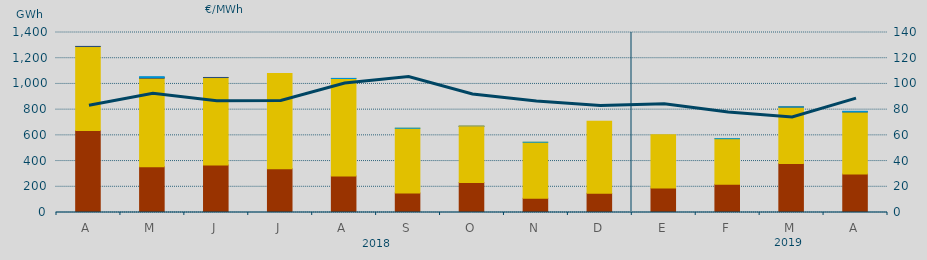
| Category | Carbón | Ciclo Combinado | Consumo Bombeo | Hidráulica | Otras Renovables |
|---|---|---|---|---|---|
| A | 637382 | 653437.2 | 1000 | 0 | 0 |
| M | 356322 | 688216.9 | 5321 | 6699 | 0 |
| J | 368722 | 680942.3 | 583.4 | 0 | 0 |
| J | 340015 | 740572.3 | 0 | 0 | 0 |
| A | 283796.9 | 758484.6 | 0 | 758.5 | 0 |
| S | 151862.8 | 503288.5 | 0 | 711.8 | 0 |
| O | 233100.2 | 436412.2 | 1448.2 | 441.9 | 60.2 |
| N | 110342 | 436088.1 | 0 | 152 | 0 |
| D | 149326 | 561113.3 | 0 | 0 | 0 |
| E | 190959 | 413339.8 | 0 | 0 | 0 |
| F | 219079.1 | 354875.6 | 0 | 360 | 0 |
| M | 380779.9 | 439376.7 | 792 | 709.4 | 0 |
| A | 299645.9 | 482984.6 | 52 | 4315.4 | 0 |